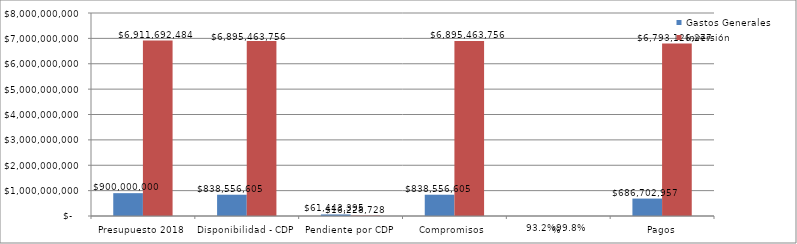
| Category | Gastos Generales  | Inversión |
|---|---|---|
| Presupuesto 2018 | 900000000.2 | 6911692484.008 |
| Disponibilidad - CDP | 838556605 | 6895463756 |
| Pendiente por CDP | 61443395.2 | 16228728.008 |
| Compromisos  | 838556605 | 6895463756.008 |
| % | 0.932 | 0.998 |
| Pagos | 686702957 | 6793126277 |